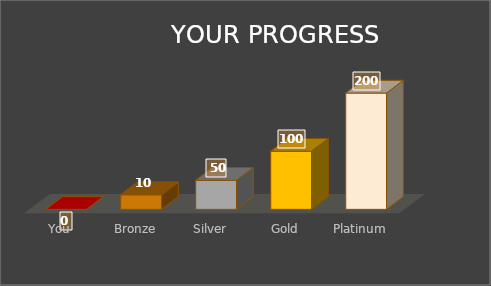
| Category | Series 0 |
|---|---|
| You | 0 |
| Bronze | 25 |
| Silver | 50 |
| Gold | 100 |
| Platinum | 200 |